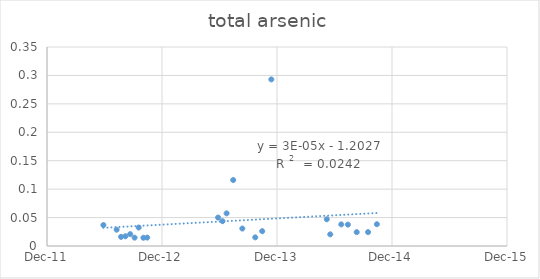
| Category | Series 0 |
|---|---|
| 41059.0 | 0.037 |
| 41101.0 | 0.029 |
| 41115.0 | 0.016 |
| 41129.0 | 0.017 |
| 41144.0 | 0.021 |
| 41158.0 | 0.015 |
| 41171.0 | 0.032 |
| 41186.0 | 0.014 |
| 41198.0 | 0.015 |
| 41423.0 | 0.05 |
| 41437.0 | 0.044 |
| 41450.0 | 0.057 |
| 41471.0 | 0.116 |
| 41500.0 | 0.031 |
| 41541.0 | 0.015 |
| 41563.0 | 0.026 |
| 41592.0 | 0.293 |
| 41768.0 | 0.047 |
| 41779.0 | 0.02 |
| 41814.0 | 0.038 |
| 41835.0 | 0.038 |
| 41863.0 | 0.024 |
| 41899.0 | 0.024 |
| 41927.0 | 0.038 |